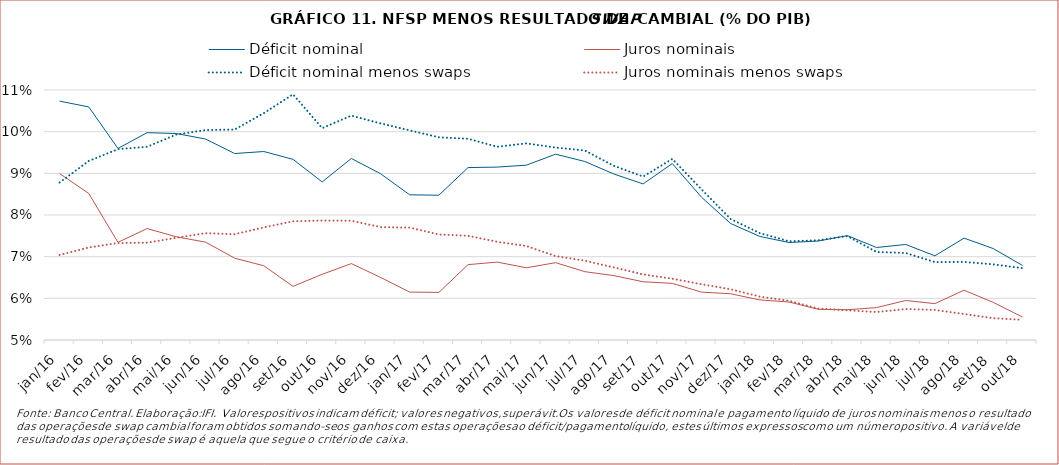
| Category | Déficit nominal | Juros nominais | Déficit nominal menos swaps | Juros nominais menos swaps |
|---|---|---|---|---|
| jan/16 | 10.733 | 8.994 | 8.781 | 7.042 |
| fev/16 | 10.594 | 8.518 | 9.297 | 7.221 |
| mar/16 | 9.596 | 7.343 | 9.58 | 7.327 |
| abr/16 | 9.976 | 7.674 | 9.637 | 7.336 |
| mai/16 | 9.955 | 7.477 | 9.931 | 7.453 |
| jun/16 | 9.824 | 7.349 | 10.039 | 7.564 |
| jul/16 | 9.476 | 6.964 | 10.051 | 7.539 |
| ago/16 | 9.523 | 6.782 | 10.444 | 7.702 |
| set/16 | 9.336 | 6.288 | 10.897 | 7.849 |
| out/16 | 8.795 | 6.577 | 10.085 | 7.867 |
| nov/16 | 9.357 | 6.833 | 10.385 | 7.862 |
| dez/16 | 8.992 | 6.503 | 10.199 | 7.71 |
| jan/17 | 8.484 | 6.149 | 10.031 | 7.697 |
| fev/17 | 8.475 | 6.142 | 9.865 | 7.532 |
| mar/17 | 9.138 | 6.809 | 9.83 | 7.501 |
| abr/17 | 9.15 | 6.87 | 9.637 | 7.357 |
| mai/17 | 9.197 | 6.733 | 9.719 | 7.255 |
| jun/17 | 9.46 | 6.856 | 9.618 | 7.014 |
| jul/17 | 9.285 | 6.64 | 9.549 | 6.904 |
| ago/17 | 8.983 | 6.545 | 9.18 | 6.741 |
| set/17 | 8.746 | 6.397 | 8.922 | 6.574 |
| out/17 | 9.235 | 6.36 | 9.346 | 6.471 |
| nov/17 | 8.428 | 6.149 | 8.617 | 6.338 |
| dez/17 | 7.796 | 6.11 | 7.903 | 6.217 |
| jan/18 | 7.485 | 5.962 | 7.565 | 6.041 |
| fev/18 | 7.34 | 5.912 | 7.368 | 5.94 |
| mar/18 | 7.375 | 5.737 | 7.393 | 5.755 |
| abr/18 | 7.506 | 5.726 | 7.493 | 5.713 |
| mai/18 | 7.22 | 5.778 | 7.113 | 5.671 |
| jun/18 | 7.293 | 5.948 | 7.088 | 5.743 |
| jul/18 | 7.02 | 5.873 | 6.87 | 5.722 |
| ago/18 | 7.445 | 6.195 | 6.873 | 5.623 |
| set/18 | 7.194 | 5.902 | 6.816 | 5.524 |
| out/18 | 6.791 | 5.551 | 6.723 | 5.484 |